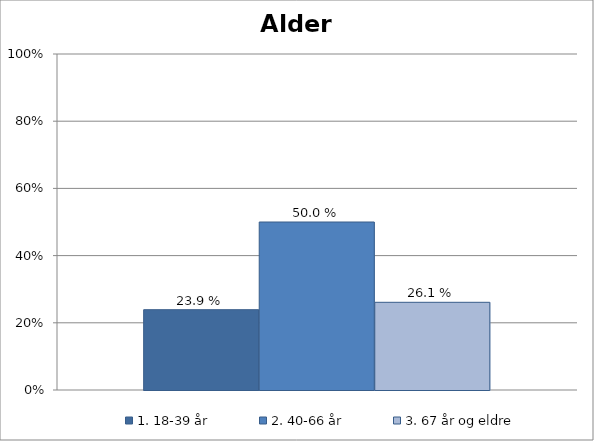
| Category | 1. 18-39 år | 2. 40-66 år | 3. 67 år og eldre |
|---|---|---|---|
| Hvor gammel er du? | 0.239 | 0.5 | 0.261 |